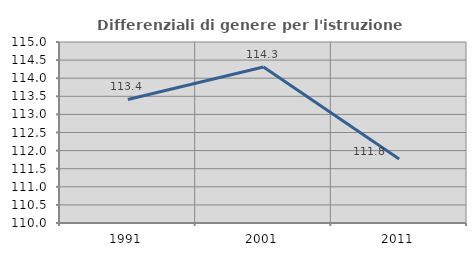
| Category | Differenziali di genere per l'istruzione superiore |
|---|---|
| 1991.0 | 113.412 |
| 2001.0 | 114.307 |
| 2011.0 | 111.77 |